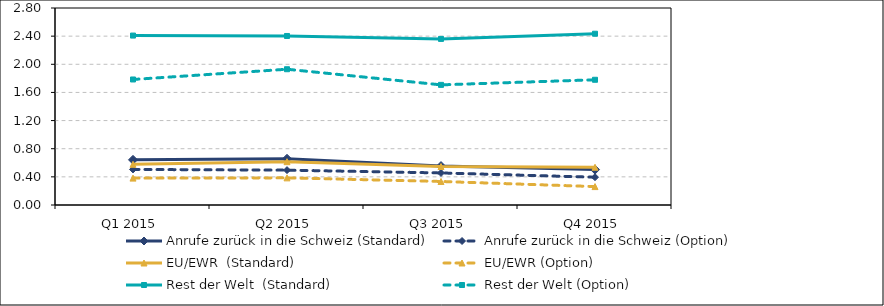
| Category | Anrufe zurück in die Schweiz (Standard) | Anrufe zurück in die Schweiz (Option) | EU/EWR  (Standard) | EU/EWR (Option) | Rest der Welt  (Standard) | Rest der Welt (Option) |
|---|---|---|---|---|---|---|
| Q1 2015 | 0.642 | 0.505 | 0.578 | 0.382 | 2.408 | 1.784 |
| Q2 2015 | 0.657 | 0.495 | 0.616 | 0.386 | 2.402 | 1.93 |
| Q3 2015 | 0.554 | 0.456 | 0.547 | 0.334 | 2.361 | 1.708 |
| Q4 2015 | 0.503 | 0.395 | 0.537 | 0.262 | 2.434 | 1.78 |